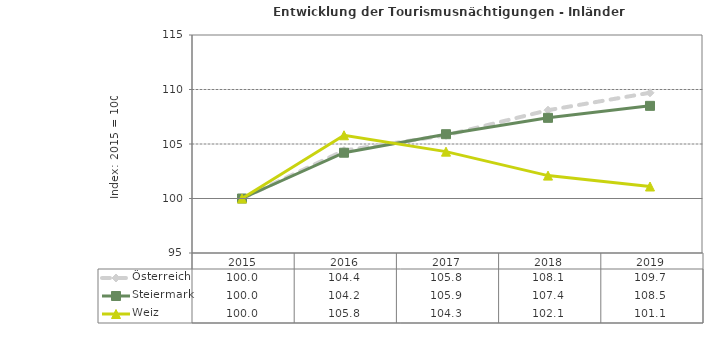
| Category | Österreich | Steiermark | Weiz |
|---|---|---|---|
| 2019.0 | 109.7 | 108.5 | 101.1 |
| 2018.0 | 108.1 | 107.4 | 102.1 |
| 2017.0 | 105.8 | 105.9 | 104.3 |
| 2016.0 | 104.4 | 104.2 | 105.8 |
| 2015.0 | 100 | 100 | 100 |